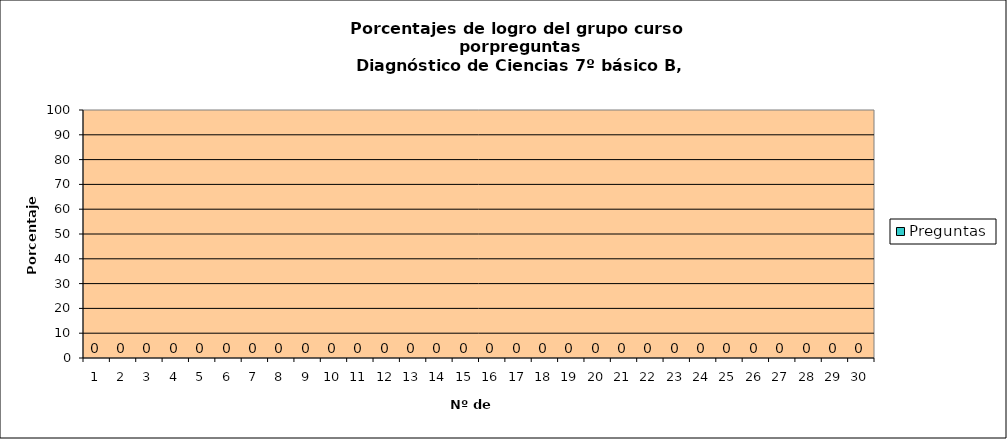
| Category | Preguntas |
|---|---|
| 0 | 0 |
| 1 | 0 |
| 2 | 0 |
| 3 | 0 |
| 4 | 0 |
| 5 | 0 |
| 6 | 0 |
| 7 | 0 |
| 8 | 0 |
| 9 | 0 |
| 10 | 0 |
| 11 | 0 |
| 12 | 0 |
| 13 | 0 |
| 14 | 0 |
| 15 | 0 |
| 16 | 0 |
| 17 | 0 |
| 18 | 0 |
| 19 | 0 |
| 20 | 0 |
| 21 | 0 |
| 22 | 0 |
| 23 | 0 |
| 24 | 0 |
| 25 | 0 |
| 26 | 0 |
| 27 | 0 |
| 28 | 0 |
| 29 | 0 |